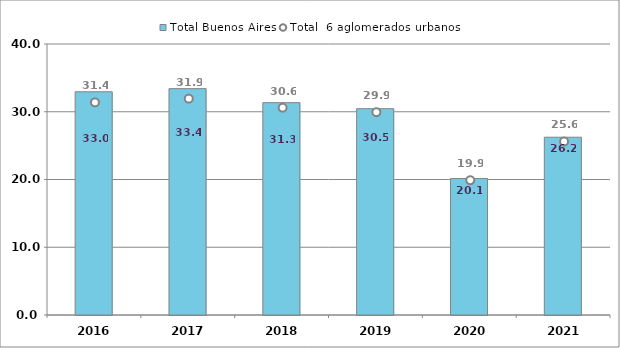
| Category | Total Buenos Aires |
|---|---|
| 2016.0 | 32.95 |
| 2017.0 | 33.41 |
| 2018.0 | 31.34 |
| 2019.0 | 30.45 |
| 2020.0 | 20.14 |
| 2021.0 | 26.24 |